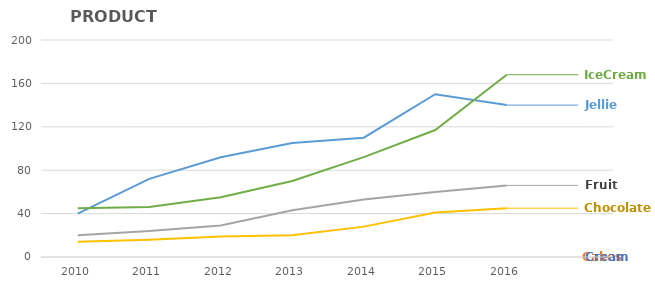
| Category | Jellies | Cakes | Fruits | Chocolates | Creams | Icecreams |
|---|---|---|---|---|---|---|
| 2010.0 | 40 |  | 20 | 14 |  | 45 |
| 2011.0 | 72 |  | 24 | 16 |  | 46 |
| 2012.0 | 92 |  | 29 | 19 |  | 55 |
| 2013.0 | 105 |  | 43 | 20 |  | 70 |
| 2014.0 | 110 |  | 53 | 28 |  | 92 |
| 2015.0 | 150 |  | 60 | 41 |  | 117 |
| 2016.0 | 140 |  | 66 | 45 |  | 168 |